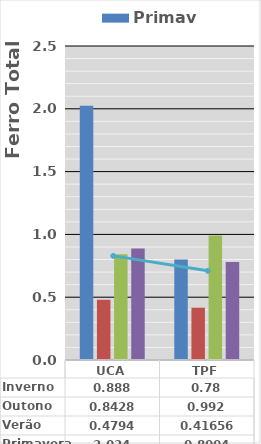
| Category | Primavera | Verão | Outono | Inverno |
|---|---|---|---|---|
| UCA | 2.024 | 0.479 | 0.843 | 0.888 |
| TPF | 0.8 | 0.417 | 0.992 | 0.78 |